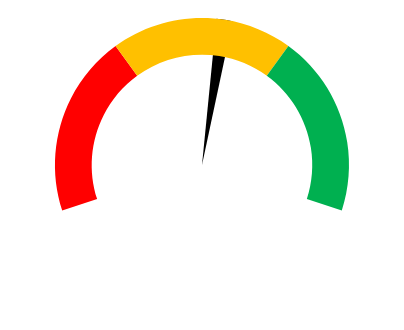
| Category | Series 1 |
|---|---|
| 0 | 0.537 |
| 1 | 0.03 |
| 2 | 1.133 |